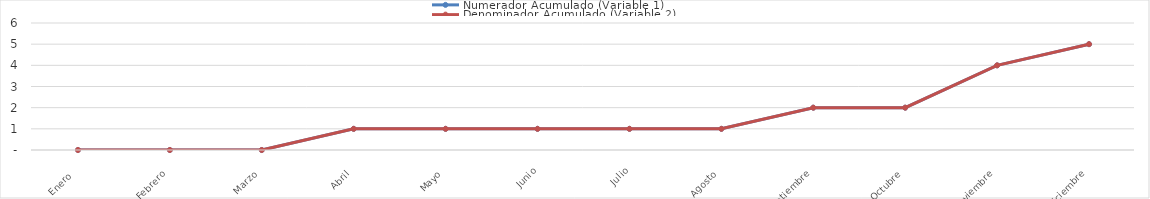
| Category | Numerador Acumulado (Variable 1) | Denominador Acumulado (Variable 2) |
|---|---|---|
| Enero  | 0 | 0 |
| Febrero | 0 | 0 |
| Marzo | 0 | 0 |
| Abril | 1 | 1 |
| Mayo | 1 | 1 |
| Junio | 1 | 1 |
| Julio | 1 | 1 |
| Agosto | 1 | 1 |
| Septiembre | 2 | 2 |
| Octubre | 2 | 2 |
| Noviembre | 4 | 4 |
| Diciembre | 5 | 5 |